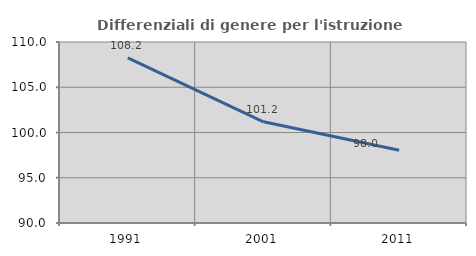
| Category | Differenziali di genere per l'istruzione superiore |
|---|---|
| 1991.0 | 108.242 |
| 2001.0 | 101.179 |
| 2011.0 | 98.031 |